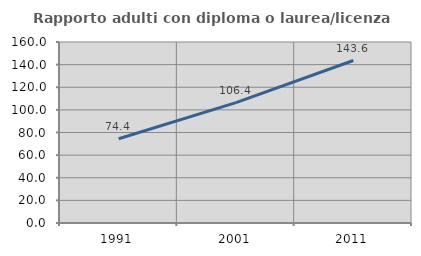
| Category | Rapporto adulti con diploma o laurea/licenza media  |
|---|---|
| 1991.0 | 74.447 |
| 2001.0 | 106.354 |
| 2011.0 | 143.622 |